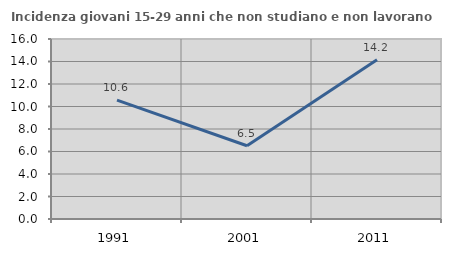
| Category | Incidenza giovani 15-29 anni che non studiano e non lavorano  |
|---|---|
| 1991.0 | 10.561 |
| 2001.0 | 6.513 |
| 2011.0 | 14.163 |